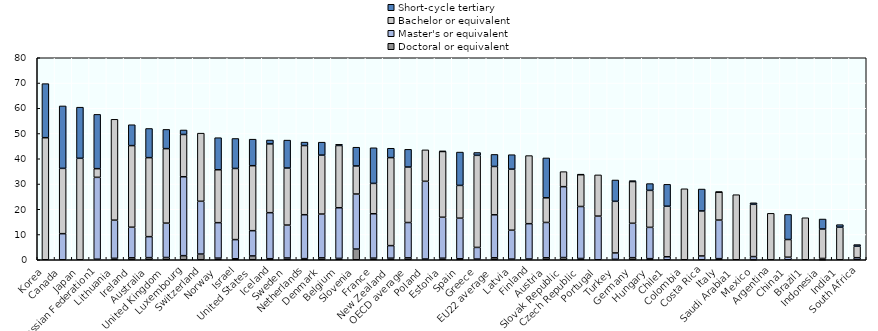
| Category | Doctoral or equivalent | Master's or equivalent | Bachelor or equivalent | Short-cycle tertiary |
|---|---|---|---|---|
| Korea | 0 | 0 | 48.34 | 21.412 |
| Canada | 0 | 10.334 | 25.854 | 24.729 |
| Japan | 0 | 0 | 40.183 | 20.244 |
| Russian Federation1 | 0.207 | 32.434 | 3.432 | 21.506 |
| Lithuania | 0.568 | 15.11 | 39.949 | 0 |
| Ireland | 0.773 | 12.116 | 32.322 | 8.263 |
| Australia | 0.837 | 8.312 | 31.29 | 11.55 |
| United Kingdom | 0.891 | 13.609 | 29.509 | 7.616 |
| Luxembourg | 1.626 | 31.25 | 16.734 | 1.786 |
| Switzerland | 2.261 | 20.901 | 26.975 | 0 |
| Norway | 0.637 | 14.052 | 20.953 | 12.694 |
| Israel | 0.385 | 7.597 | 28.172 | 11.874 |
| United States | 1.52 | 10.002 | 25.726 | 10.509 |
| Iceland | 0.417 | 18.223 | 27.25 | 1.529 |
| Sweden | 0.696 | 13.03 | 22.598 | 11.064 |
| Netherlands | 0.439 | 17.396 | 27.393 | 1.366 |
| Denmark | 0.752 | 17.346 | 23.339 | 5.133 |
| Belgium | 0.541 | 20.059 | 24.657 | 0.468 |
| Slovenia | 4.23 | 21.8 | 11.12 | 7.42 |
| France | 0.633 | 17.59 | 12.017 | 14.105 |
| New Zealand | 0.62 | 4.979 | 34.852 | 3.708 |
| OECD average | 0.754 | 13.988 | 21.979 | 7.014 |
| Poland | 0.281 | 30.785 | 12.46 | 0 |
| Estonia | 0.612 | 16.221 | 26.043 | 0.164 |
| Spain | 0.399 | 16.069 | 12.978 | 13.198 |
| Greece | 0.271 | 4.613 | 36.466 | 1.13 |
| EU22 average | 0.779 | 17.025 | 19.144 | 4.768 |
| Latvia | 0.257 | 11.446 | 24.178 | 5.727 |
| Finland | 0.292 | 13.994 | 26.968 | 0 |
| Austria | 0.768 | 13.998 | 9.765 | 15.794 |
| Slovak Republic | 0.872 | 28.07 | 5.956 | 0 |
| Czech Republic | 0.504 | 20.592 | 12.609 | 0.117 |
| Portugal | 0 | 17.286 | 16.325 | 0 |
| Turkey | 0.168 | 2.533 | 20.441 | 8.447 |
| Germany | 0.827 | 13.622 | 16.521 | 0.339 |
| Hungary | 0.434 | 12.4 | 14.647 | 2.681 |
| Chile1 | 0 | 1.192 | 20.002 | 8.68 |
| Colombia | 0 | 0 | 28.107 | 0 |
| Costa Rica | 0 | 1.508 | 17.825 | 8.671 |
| Italy | 0.434 | 15.281 | 11.086 | 0.015 |
| Saudi Arabia1 | 0 | 0 | 25.763 | 0 |
| Mexico | 0.032 | 1.221 | 20.702 | 0.6 |
| Argentina | 0 | 0 | 18.389 | 0 |
| China1 | 0 | 1.013 | 6.998 | 9.938 |
| Brazil1 | 0 | 0 | 16.628 | 0 |
| Indonesia | 0.01 | 0.505 | 11.668 | 3.947 |
| India1 | 0 | 0 | 12.907 | 0.992 |
| South Africa | 0 | 0.822 | 4.549 | 0.639 |